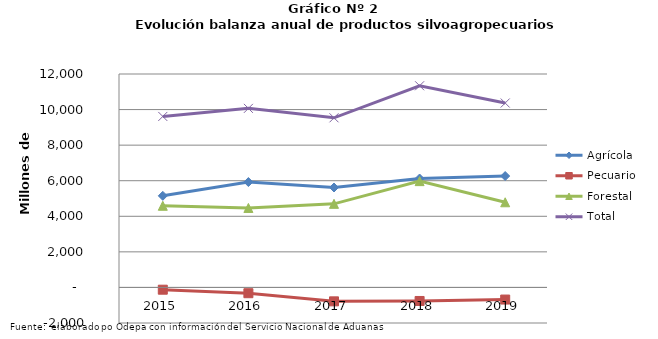
| Category | Agrícola | Pecuario | Forestal | Total |
|---|---|---|---|---|
| 2015.0 | 5149872 | -127785 | 4591408 | 9613495 |
| 2016.0 | 5924661 | -325421 | 4468104 | 10067344 |
| 2017.0 | 5619304 | -782654 | 4700192 | 9536842 |
| 2018.0 | 6124360 | -761989 | 5976134 | 11338505 |
| 2019.0 | 6262627 | -681781 | 4787484 | 10368330 |